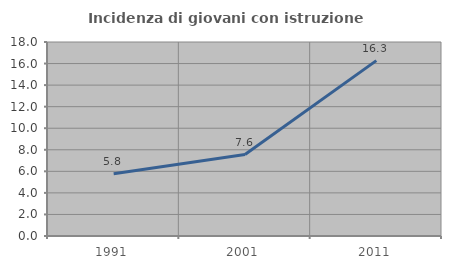
| Category | Incidenza di giovani con istruzione universitaria |
|---|---|
| 1991.0 | 5.772 |
| 2001.0 | 7.557 |
| 2011.0 | 16.269 |